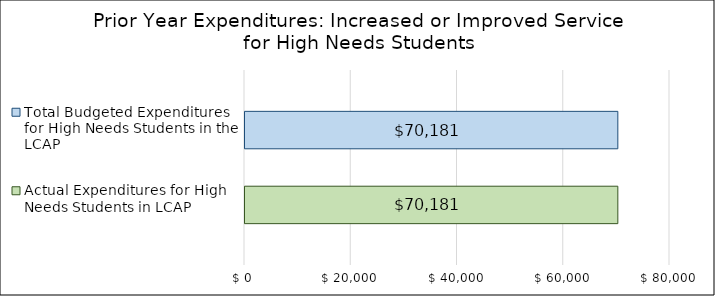
| Category | Actual Expenditures for High Needs Students in LCAP | Total Budgeted Expenditures for High Needs Students in the LCAP |
|---|---|---|
| 0 | 70181 | 70181 |